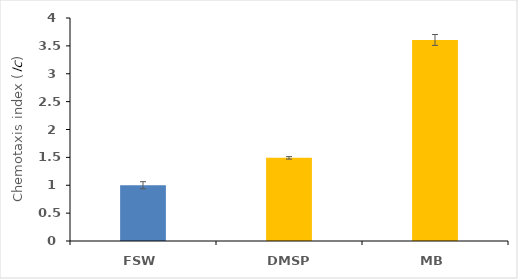
| Category | Series 0 |
|---|---|
| FSW | 1 |
| DMSP | 1.491 |
| MB | 3.607 |